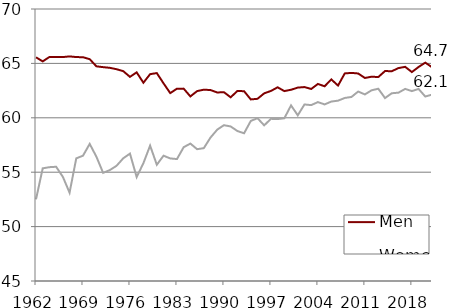
| Category | Men | Women |
|---|---|---|
| 1962.0 | 65.559 | 52.506 |
| 1963.0 | 65.185 | 55.355 |
| 1964.0 | 65.59 | 55.462 |
| 1965.0 | 65.589 | 55.501 |
| 1966.0 | 65.582 | 54.579 |
| 1967.0 | 65.644 | 53.118 |
| 1968.0 | 65.582 | 56.273 |
| 1969.0 | 65.568 | 56.517 |
| 1970.0 | 65.39 | 57.599 |
| 1971.0 | 64.73 | 56.425 |
| 1972.0 | 64.656 | 54.94 |
| 1973.0 | 64.593 | 55.194 |
| 1974.0 | 64.467 | 55.589 |
| 1975.0 | 64.287 | 56.278 |
| 1976.0 | 63.763 | 56.71 |
| 1977.0 | 64.176 | 54.555 |
| 1978.0 | 63.223 | 55.827 |
| 1979.0 | 64.011 | 57.444 |
| 1980.0 | 64.11 | 55.685 |
| 1981.0 | 63.17 | 56.517 |
| 1982.0 | 62.27 | 56.266 |
| 1983.0 | 62.677 | 56.207 |
| 1984.0 | 62.681 | 57.296 |
| 1985.0 | 61.964 | 57.632 |
| 1986.0 | 62.453 | 57.116 |
| 1987.0 | 62.586 | 57.21 |
| 1988.0 | 62.552 | 58.185 |
| 1989.0 | 62.328 | 58.908 |
| 1990.0 | 62.354 | 59.321 |
| 1991.0 | 61.884 | 59.206 |
| 1992.0 | 62.461 | 58.787 |
| 1993.0 | 62.447 | 58.578 |
| 1994.0 | 61.689 | 59.71 |
| 1995.0 | 61.746 | 59.966 |
| 1996.0 | 62.249 | 59.305 |
| 1997.0 | 62.468 | 59.905 |
| 1998.0 | 62.802 | 59.885 |
| 1999.0 | 62.454 | 59.956 |
| 2000.0 | 62.577 | 61.142 |
| 2001.0 | 62.775 | 60.228 |
| 2002.0 | 62.825 | 61.227 |
| 2003.0 | 62.651 | 61.166 |
| 2004.0 | 63.112 | 61.443 |
| 2005.0 | 62.897 | 61.231 |
| 2006.0 | 63.529 | 61.493 |
| 2007.0 | 62.961 | 61.576 |
| 2008.0 | 64.078 | 61.824 |
| 2009.0 | 64.128 | 61.915 |
| 2010.0 | 64.074 | 62.415 |
| 2011.0 | 63.661 | 62.149 |
| 2012.0 | 63.777 | 62.528 |
| 2013.0 | 63.747 | 62.672 |
| 2014.0 | 64.297 | 61.814 |
| 2015.0 | 64.281 | 62.256 |
| 2016.0 | 64.568 | 62.311 |
| 2017.0 | 64.685 | 62.654 |
| 2018.0 | 64.205 | 62.456 |
| 2019.0 | 64.671 | 62.652 |
| 2020.0 | 65.07 | 61.955 |
| 2021.0 | 64.651 | 62.132 |